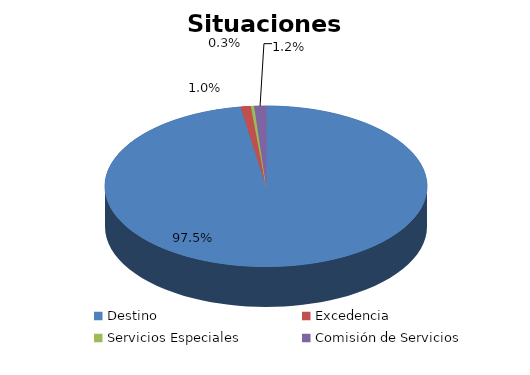
| Category | Series 0 |
|---|---|
| Destino | 2580 |
| Excedencia | 27 |
| Servicios Especiales | 9 |
| Comisión de Servicios | 31 |